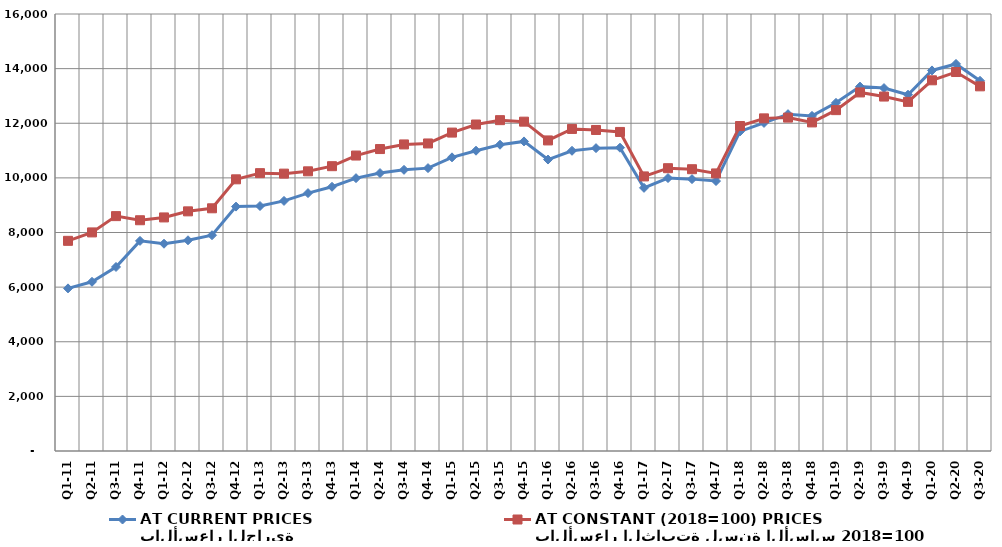
| Category | بالأسعار الجارية
AT CURRENT PRICES | بالأسعار الثابتة لسنة الأساس 2018=100
AT CONSTANT (2018=100) PRICES |
|---|---|---|
| Q1-11 | 5953.836 | 7694.843 |
| Q2-11 | 6195.49 | 8003.235 |
| Q3-11 | 6737.451 | 8599.634 |
| Q4-11 | 7693.189 | 8448.613 |
| Q1-12 | 7589.011 | 8551.906 |
| Q2-12 | 7715.291 | 8774.584 |
| Q3-12 | 7899.946 | 8886.183 |
| Q4-12 | 8948.182 | 9947.065 |
| Q1-13 | 8969.612 | 10173.221 |
| Q2-13 | 9156.382 | 10155.604 |
| Q3-13 | 9442.572 | 10239.765 |
| Q4-13 | 9673.936 | 10428.235 |
| Q1-14 | 9990.166 | 10817.551 |
| Q2-14 | 10175.72 | 11055.091 |
| Q3-14 | 10294.082 | 11224.333 |
| Q4-14 | 10357.028 | 11259.895 |
| Q1-15 | 10751.932 | 11657.991 |
| Q2-15 | 10994.405 | 11953.732 |
| Q3-15 | 11212.846 | 12113.484 |
| Q4-15 | 11334.591 | 12058.209 |
| Q1-16 | 10671.356 | 11371.048 |
| Q2-16 | 10992.547 | 11791.542 |
| Q3-16 | 11089.042 | 11753.865 |
| Q4-16 | 11104.374 | 11681.903 |
| Q1-17 | 9634.832 | 10053.618 |
| Q2-17 | 9993.326 | 10354.54 |
| Q3-17 | 9954.103 | 10316.968 |
| Q4-17 | 9883.955 | 10162.803 |
| Q1-18 | 11700.195 | 11898.597 |
| Q2-18 | 12012.448 | 12178.642 |
| Q3-18 | 12332.135 | 12207.054 |
| Q4-18 | 12270.053 | 12030.539 |
| Q1-19 | 12747.614 | 12480.104 |
| Q2-19 | 13341.818 | 13128.651 |
| Q3-19 | 13287.67 | 12977.567 |
| Q4-19 | 13044.1 | 12782.691 |
| Q1-20 | 13933.967 | 13572.097 |
| Q2-20 | 14171.848 | 13875.531 |
| Q3-20 | 13554.812 | 13351.431 |